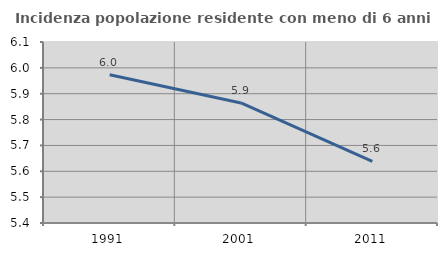
| Category | Incidenza popolazione residente con meno di 6 anni |
|---|---|
| 1991.0 | 5.973 |
| 2001.0 | 5.864 |
| 2011.0 | 5.638 |